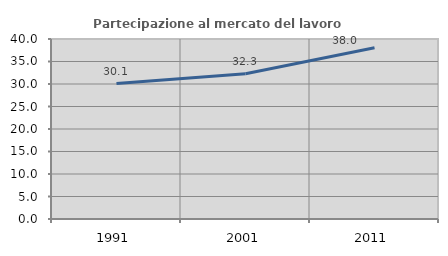
| Category | Partecipazione al mercato del lavoro  femminile |
|---|---|
| 1991.0 | 30.097 |
| 2001.0 | 32.277 |
| 2011.0 | 38.048 |